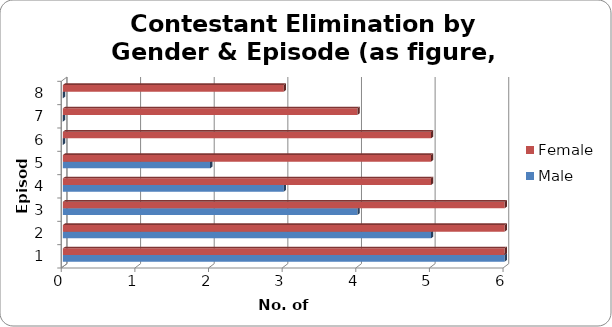
| Category | Male | Female |
|---|---|---|
| 0 | 6 | 6 |
| 1 | 5 | 6 |
| 2 | 4 | 6 |
| 3 | 3 | 5 |
| 4 | 2 | 5 |
| 5 | 0 | 5 |
| 6 | 0 | 4 |
| 7 | 0 | 3 |